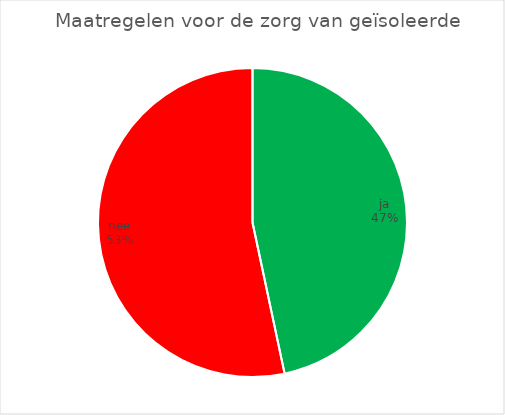
| Category | Maatregelen voor de zorg van geïsoleerde bewoners |
|---|---|
| ja | 7 |
| nee | 8 |